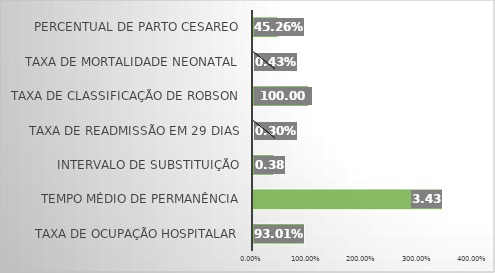
| Category | Series 0 |
|---|---|
| Taxa de Ocupação Hospitalar | 0.93 |
| Tempo Médio de permanência | 3.43 |
| Intervalo de substituição | 0.38 |
| Taxa de readmissão em 29 dias | 0.003 |
| Taxa de classificação de Robson | 1 |
| Taxa de mortalidade neonatal | 0.004 |
| Percentual de parto cesareo | 0.453 |